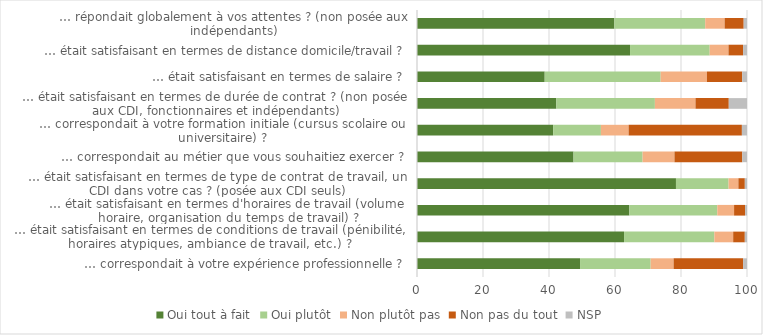
| Category | Oui tout à fait | Oui plutôt | Non plutôt pas | Non pas du tout | NSP |
|---|---|---|---|---|---|
| … répondait globalement à vos attentes ? (non posée aux indépendants) | 59.783 | 27.554 | 5.88 | 5.781 | 1.002 |
| … était satisfaisant en termes de distance domicile/travail ? | 64.556 | 24.14 | 5.696 | 4.425 | 1.183 |
| … était satisfaisant en termes de salaire ? | 38.698 | 35.142 | 14.014 | 10.697 | 1.449 |
| … était satisfaisant en termes de durée de contrat ? (non posée aux CDI, fonctionnaires et indépendants) | 42.227 | 29.861 | 12.303 | 10.088 | 5.521 |
| … correspondait à votre formation initiale (cursus scolaire ou universitaire) ? | 41.26 | 14.469 | 8.397 | 34.328 | 1.546 |
| … correspondait au métier que vous souhaitiez exercer ? | 47.433 | 20.93 | 9.66 | 20.547 | 1.431 |
| … était satisfaisant en termes de type de contrat de travail, un CDI dans votre cas ? (posée aux CDI seuls) | 78.473 | 15.942 | 2.975 | 1.949 | 0.66 |
| … était satisfaisant en termes d'horaires de travail (volume horaire, organisation du temps de travail) ? | 64.353 | 26.64 | 5.093 | 3.35 | 0.564 |
| … était satisfaisant en termes de conditions de travail (pénibilité, horaires atypiques, ambiance de travail, etc.) ? | 62.746 | 27.36 | 5.708 | 3.522 | 0.663 |
| … correspondait à votre expérience professionnelle ? | 49.407 | 21.395 | 6.961 | 21.052 | 1.186 |